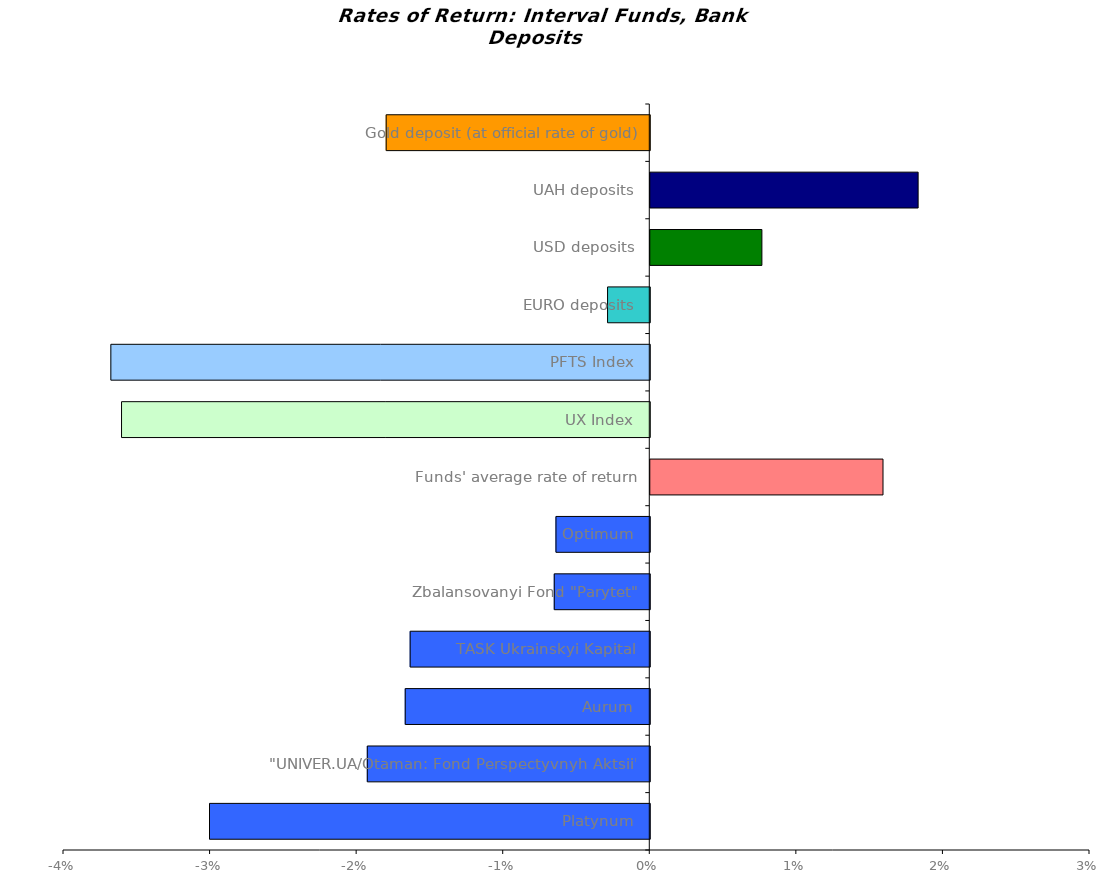
| Category | Series 0 |
|---|---|
| Platynum | -0.03 |
| "UNIVER.UA/Otaman: Fond Perspectyvnyh Aktsii" | -0.019 |
| Aurum | -0.017 |
| TASK Ukrainskyi Kapital | -0.016 |
| Zbalansovanyi Fond "Parytet" | -0.007 |
| Optimum | -0.006 |
| Funds' average rate of return | 0.016 |
| UX Index | -0.036 |
| PFTS Index | -0.037 |
| EURO deposits | -0.003 |
| USD deposits | 0.008 |
| UAH deposits | 0.018 |
| Gold deposit (at official rate of gold) | -0.018 |